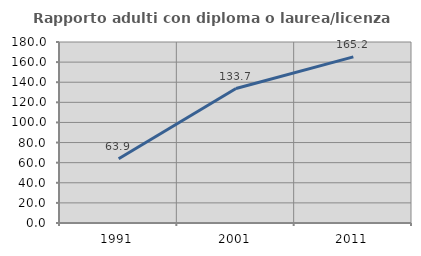
| Category | Rapporto adulti con diploma o laurea/licenza media  |
|---|---|
| 1991.0 | 63.934 |
| 2001.0 | 133.735 |
| 2011.0 | 165.169 |